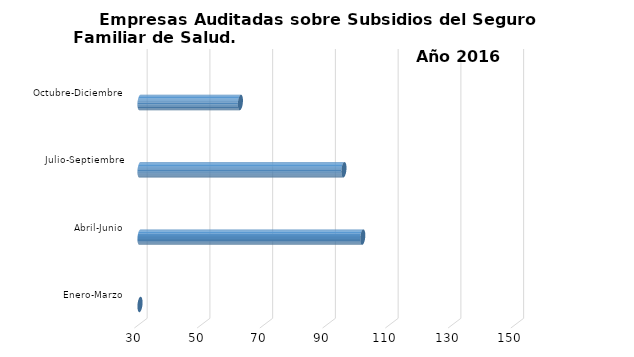
| Category | Empresas Auditadas | Series 1 | Series 2 |
|---|---|---|---|
| Enero-Marzo | 30 |  |  |
| Abril-Junio | 101 |  |  |
| Julio-Septiembre | 95 |  |  |
| Octubre-Diciembre | 62 |  |  |